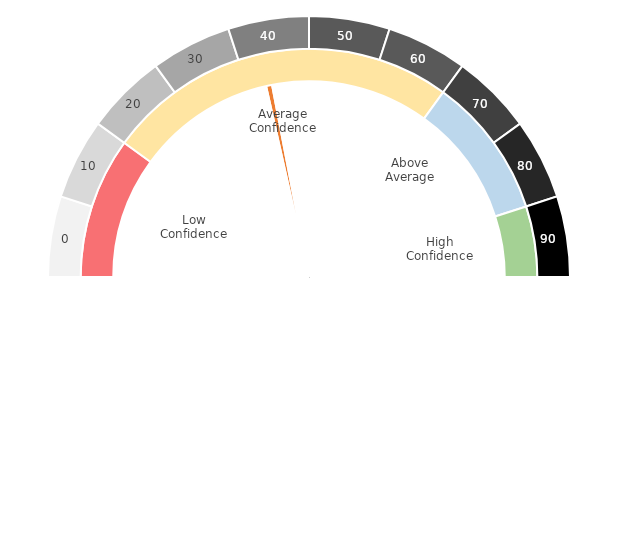
| Category | Pointer |
|---|---|
| 0 | 43.176 |
| 1 | 1 |
| 2 | 156.824 |